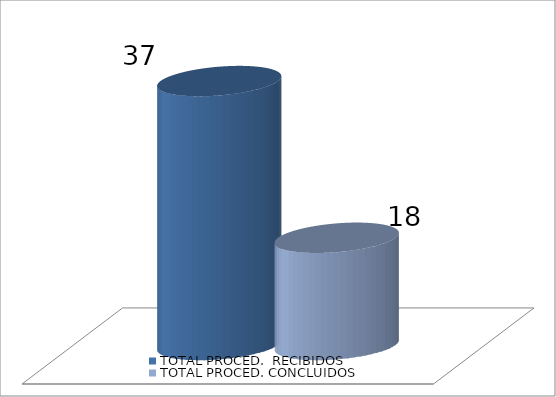
| Category | TOTAL PROCED.  RECIBIDOS | TOTAL PROCED. CONCLUIDOS |
|---|---|---|
| 0 | 37 | 18 |